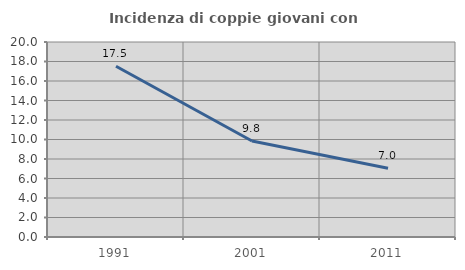
| Category | Incidenza di coppie giovani con figli |
|---|---|
| 1991.0 | 17.518 |
| 2001.0 | 9.848 |
| 2011.0 | 7.045 |